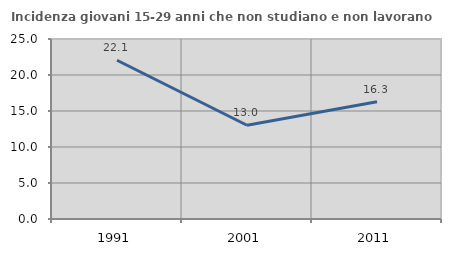
| Category | Incidenza giovani 15-29 anni che non studiano e non lavorano  |
|---|---|
| 1991.0 | 22.05 |
| 2001.0 | 13.02 |
| 2011.0 | 16.284 |